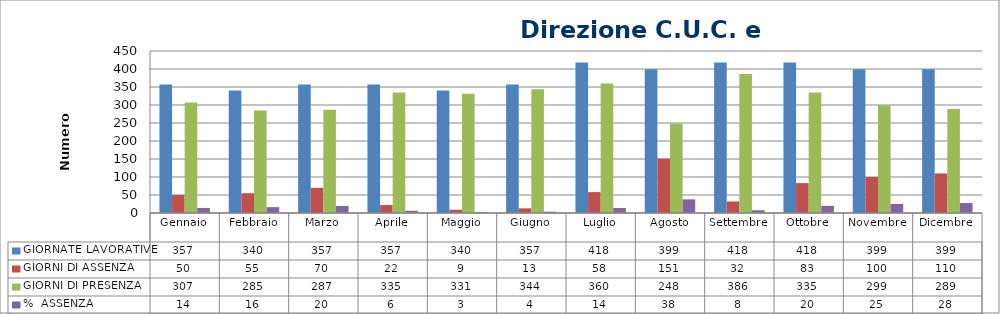
| Category | GIORNATE LAVORATIVE | GIORNI DI ASSENZA | GIORNI DI PRESENZA | %  ASSENZA |
|---|---|---|---|---|
| Gennaio | 357 | 50 | 307 | 14.006 |
| Febbraio | 340 | 55 | 285 | 16.176 |
| Marzo | 357 | 70 | 287 | 19.608 |
| Aprile | 357 | 22 | 335 | 6.162 |
| Maggio | 340 | 9 | 331 | 2.647 |
| Giugno | 357 | 13 | 344 | 3.641 |
| Luglio | 418 | 58 | 360 | 13.876 |
| Agosto | 399 | 151 | 248 | 37.845 |
| Settembre | 418 | 32 | 386 | 7.656 |
| Ottobre | 418 | 83 | 335 | 19.856 |
| Novembre | 399 | 100 | 299 | 25.063 |
| Dicembre | 399 | 110 | 289 | 27.569 |